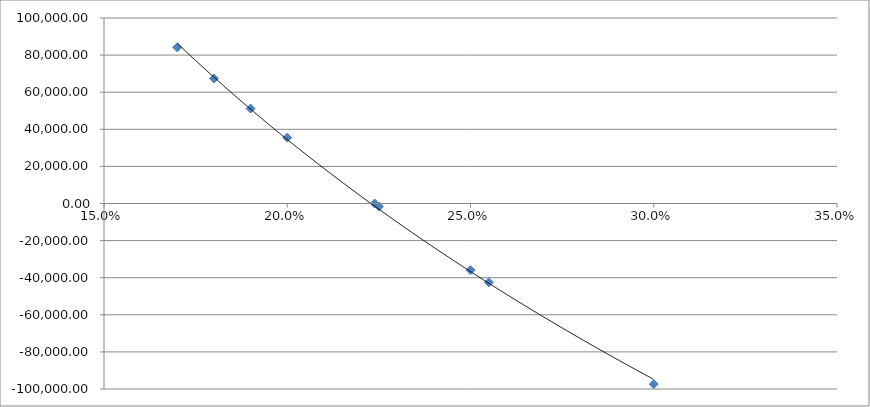
| Category | Series 0 |
|---|---|
| 0.17 | 84122.375 |
| 0.18 | 67384.041 |
| 0.19 | 51182.035 |
| 0.2 | 35493.827 |
| 0.223869205725982 | 0 |
| 0.225 | -1616.491 |
| 0.25 | -35952 |
| 0.255 | -42510.404 |
| 0.3 | -97344.281 |